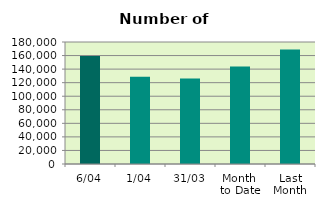
| Category | Series 0 |
|---|---|
| 6/04 | 159370 |
| 1/04 | 128692 |
| 31/03 | 126020 |
| Month 
to Date | 144031 |
| Last
Month | 168827.304 |